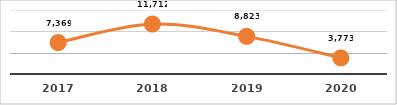
| Category | SERVICIOS TECNOLÓGICOS PROPORCIONADOS
PRIMER SEMESTRE, EJERCICIO 2020 |
|---|---|
| 2017.0 | 7369 |
| 2018.0 | 11712 |
| 2019.0 | 8823 |
| 2020.0 | 3773 |